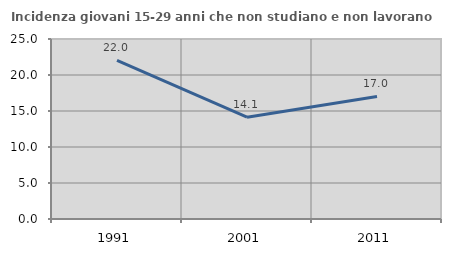
| Category | Incidenza giovani 15-29 anni che non studiano e non lavorano  |
|---|---|
| 1991.0 | 22.017 |
| 2001.0 | 14.145 |
| 2011.0 | 17.027 |